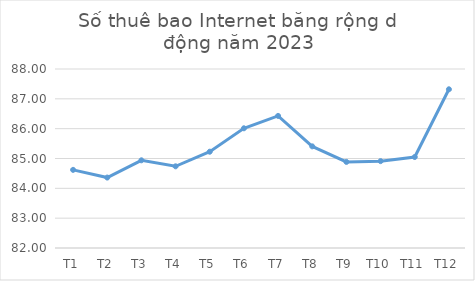
| Category | Series 0 |
|---|---|
| T1 | 84.619 |
| T2 | 84.361 |
| T3 | 84.939 |
| T4 | 84.738 |
| T5 | 85.228 |
| T6 | 86.013 |
| T7 | 86.428 |
| T8 | 85.407 |
| T9 | 84.886 |
| T10 | 84.912 |
| T11 | 85.05 |
| T12 | 87.32 |